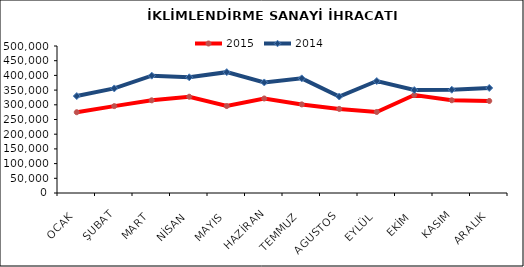
| Category | 2015 | 2014 |
|---|---|---|
| OCAK | 274713.805 | 329790.55 |
| ŞUBAT | 295502.688 | 355759.345 |
| MART | 315256.798 | 399030.644 |
| NİSAN | 327423.734 | 393686.561 |
| MAYIS | 295736.906 | 411021.459 |
| HAZİRAN | 321424.878 | 376015.998 |
| TEMMUZ | 301376.772 | 389896.022 |
| AGUSTOS | 285985.47 | 328196.933 |
| EYLÜL | 275638.903 | 380868.539 |
| EKİM | 333418.437 | 350153.132 |
| KASIM | 315493.004 | 351212.397 |
| ARALIK | 313101.522 | 357174.544 |